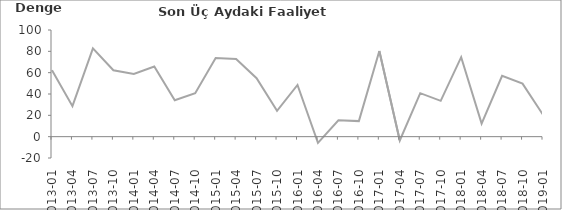
| Category | Son Üç Aydaki Faaliyet Giderleri |
|---|---|
| 2013-01 | 62.3 |
| 2013-04 | 28.6 |
| 2013-07 | 82.8 |
| 2013-10 | 62.3 |
| 2014-01 | 58.7 |
| 2014-04 | 65.7 |
| 2014-07 | 34.2 |
| 2014-10 | 40.8 |
| 2015-01 | 73.7 |
| 2015-04 | 72.9 |
| 2015-07 | 54.8 |
| 2015-10 | 24.3 |
| 2016-01 | 48.5 |
| 2016-04 | -5.8 |
| 2016-07 | 15.4 |
| 2016-10 | 14.6 |
| 2017-01 | 80.4 |
| 2017-04 | -3.6 |
| 2017-07 | 40.8 |
| 2017-10 | 33.6 |
| 2018-01 | 74.5 |
| 2018-04 | 12.2 |
| 2018-07 | 57.1 |
| 2018-10 | 49.7 |
| 2019-01 | 20.5 |